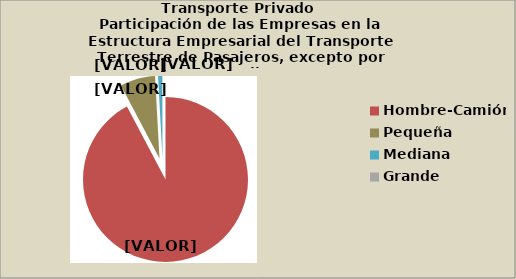
| Category | Series 0 |
|---|---|
| Hombre-Camión | 92.2 |
| Pequeña | 6.872 |
| Mediana | 0.787 |
| Grande | 0.072 |